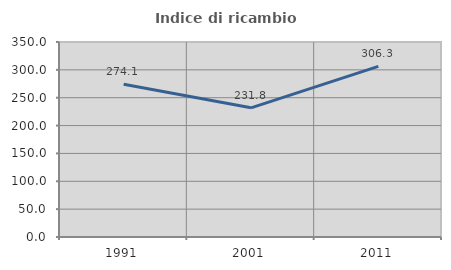
| Category | Indice di ricambio occupazionale  |
|---|---|
| 1991.0 | 274.074 |
| 2001.0 | 231.818 |
| 2011.0 | 306.25 |